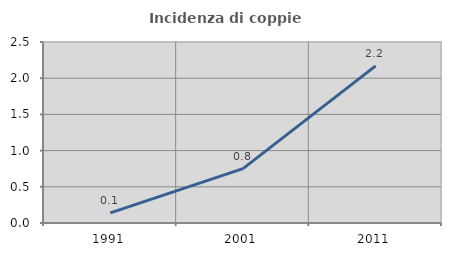
| Category | Incidenza di coppie miste |
|---|---|
| 1991.0 | 0.14 |
| 2001.0 | 0.751 |
| 2011.0 | 2.17 |